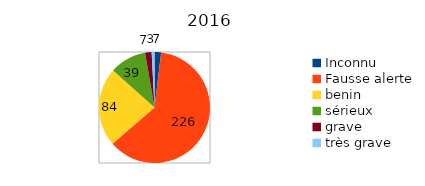
| Category | Series 0 |
|---|---|
| Inconnu | 7 |
| Fausse alerte | 226 |
| benin | 84 |
| sérieux | 39 |
| grave | 7 |
| très grave | 3 |